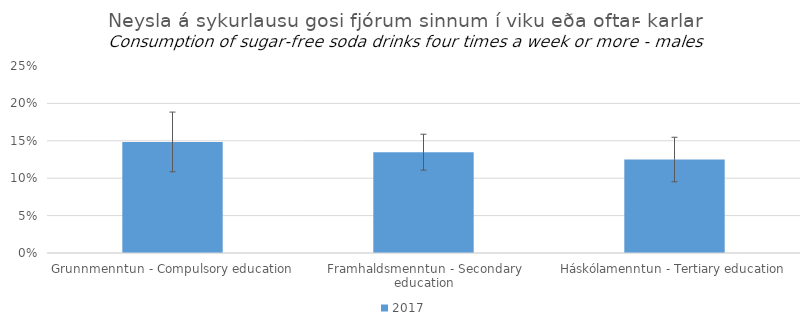
| Category | 2017 |
|---|---|
| Grunnmenntun - Compulsory education | 0.148 |
| Framhaldsmenntun - Secondary education | 0.135 |
| Háskólamenntun - Tertiary education | 0.125 |